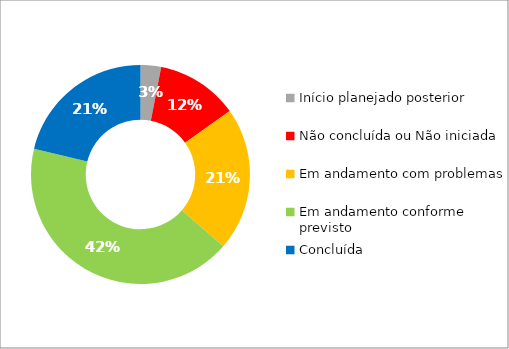
| Category | Series 0 |
|---|---|
| Início planejado posterior | 1 |
| Não concluída ou Não iniciada | 4 |
| Em andamento com problemas | 7 |
| Em andamento conforme previsto | 14 |
| Concluída | 7 |